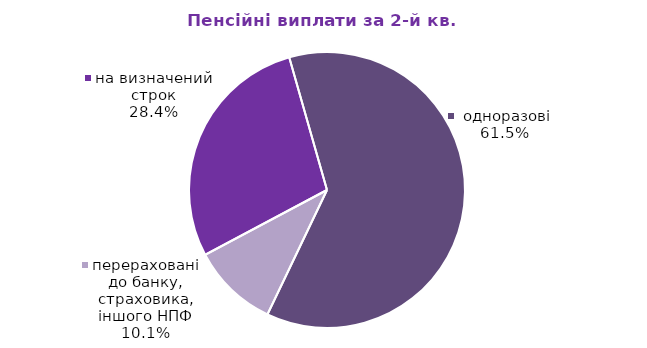
| Category | Series 0 |
|---|---|
| на визначений строк | 9.158 |
|  одноразові | 19.864 |
| перераховані до банку, страховика, іншого НПФ | 3.267 |